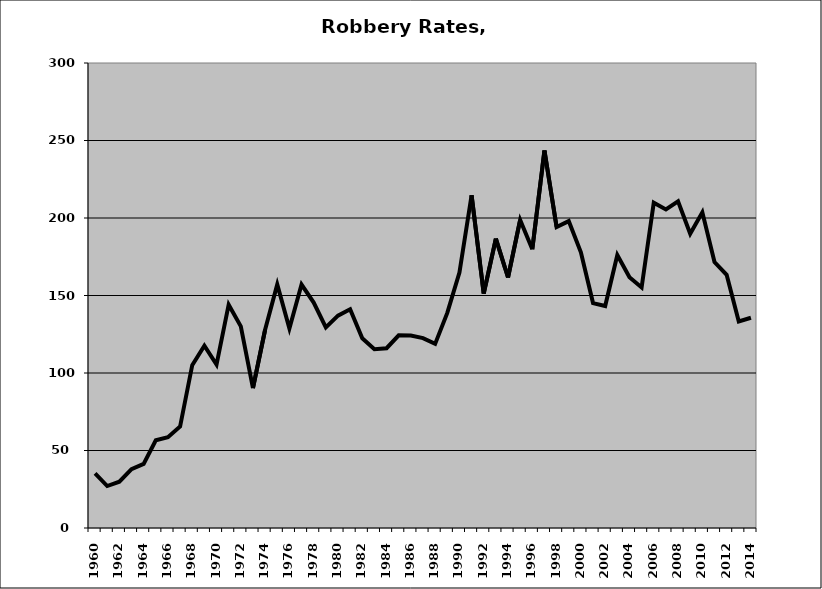
| Category | Robbery |
|---|---|
| 1960.0 | 35.179 |
| 1961.0 | 27.074 |
| 1962.0 | 29.851 |
| 1963.0 | 38.025 |
| 1964.0 | 41.344 |
| 1965.0 | 56.634 |
| 1966.0 | 58.594 |
| 1967.0 | 65.458 |
| 1968.0 | 105.056 |
| 1969.0 | 117.593 |
| 1970.0 | 105.454 |
| 1971.0 | 144.086 |
| 1972.0 | 130.088 |
| 1973.0 | 90.278 |
| 1974.0 | 127.923 |
| 1975.0 | 157.168 |
| 1976.0 | 128.694 |
| 1977.0 | 157.045 |
| 1978.0 | 145.455 |
| 1979.0 | 129.381 |
| 1980.0 | 137.026 |
| 1981.0 | 141.137 |
| 1982.0 | 122.425 |
| 1983.0 | 115.347 |
| 1984.0 | 115.987 |
| 1985.0 | 124.277 |
| 1986.0 | 124.171 |
| 1987.0 | 122.516 |
| 1988.0 | 118.788 |
| 1989.0 | 138.782 |
| 1990.0 | 164.823 |
| 1991.0 | 214.706 |
| 1992.0 | 151.234 |
| 1993.0 | 186.714 |
| 1994.0 | 161.615 |
| 1995.0 | 198.745 |
| 1996.0 | 179.862 |
| 1997.0 | 243.579 |
| 1998.0 | 194.22 |
| 1999.0 | 197.999 |
| 2000.0 | 177.897 |
| 2001.0 | 145.117 |
| 2002.0 | 143.186 |
| 2003.0 | 176.126 |
| 2004.0 | 161.794 |
| 2005.0 | 155.155 |
| 2006.0 | 209.848 |
| 2007.0 | 205.49 |
| 2008.0 | 210.794 |
| 2009.0 | 189.804 |
| 2010.0 | 203.69 |
| 2011.0 | 171.56 |
| 2012.0 | 163.349 |
| 2013.0 | 133.263 |
| 2014.0 | 135.633 |